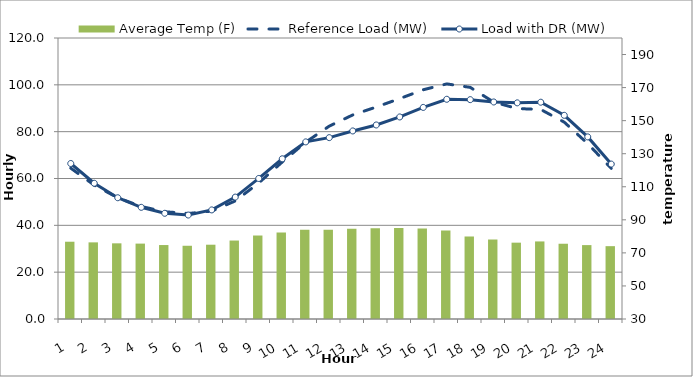
| Category | Average Temp (F) |
|---|---|
| 0 | 76.751 |
| 1 | 76.361 |
| 2 | 75.777 |
| 3 | 75.612 |
| 4 | 74.743 |
| 5 | 74.304 |
| 6 | 74.943 |
| 7 | 77.467 |
| 8 | 80.51 |
| 9 | 82.35 |
| 10 | 83.984 |
| 11 | 83.991 |
| 12 | 84.613 |
| 13 | 84.89 |
| 14 | 85.02 |
| 15 | 84.792 |
| 16 | 83.612 |
| 17 | 79.916 |
| 18 | 78.092 |
| 19 | 76.183 |
| 20 | 76.925 |
| 21 | 75.531 |
| 22 | 74.708 |
| 23 | 74.067 |